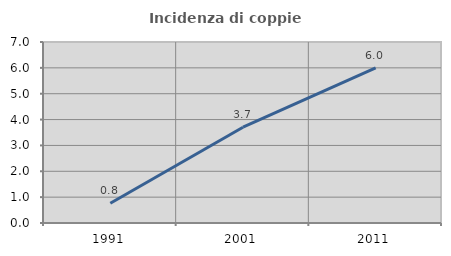
| Category | Incidenza di coppie miste |
|---|---|
| 1991.0 | 0.761 |
| 2001.0 | 3.704 |
| 2011.0 | 6 |